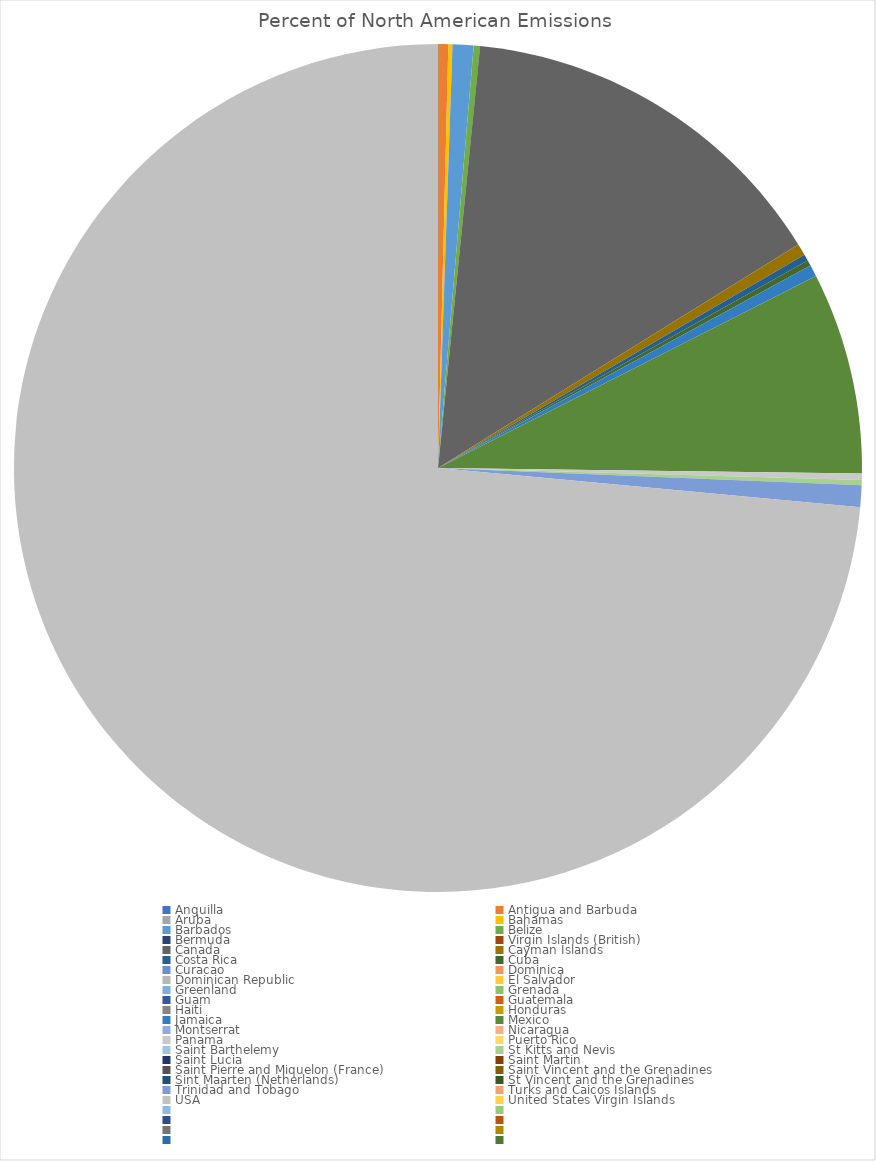
| Category | Percent of North American Emissions  |
|---|---|
| Anguilla | 0 |
| Antigua and Barbuda | 0.004 |
| Aruba | 0 |
| Bahamas | 0.002 |
| Barbados | 0.008 |
| Belize | 0.002 |
| Bermuda | 0 |
| Virgin Islands (British) | 0 |
| Canada | 0.146 |
| Cayman Islands | 0.004 |
| Costa Rica | 0.003 |
| Cuba | 0.002 |
| Curacao | 0 |
| Dominica | 0 |
| Dominican Republic | 0 |
| El Salvador | 0 |
| Greenland | 0 |
| Grenada | 0 |
| Guam | 0 |
| Guatemala | 0 |
| Haiti | 0 |
| Honduras | 0 |
| Jamaica | 0.004 |
| Mexico | 0.077 |
| Montserrat | 0 |
| Nicaragua | 0 |
| Panama | 0.002 |
| Puerto Rico | 0 |
| Saint Barthelemy | 0 |
| St Kitts and Nevis | 0.002 |
| Saint Lucia | 0 |
| Saint Martin | 0 |
| Saint Pierre and Miquelon (France) | 0 |
| Saint Vincent and the Grenadines | 0 |
| Sint Maarten (Netherlands) | 0 |
| St Vincent and the Grenadines | 0 |
| Trinidad and Tobago | 0.008 |
| Turks and Caicos Islands | 0 |
| USA | 0.735 |
| United States Virgin Islands | 0 |